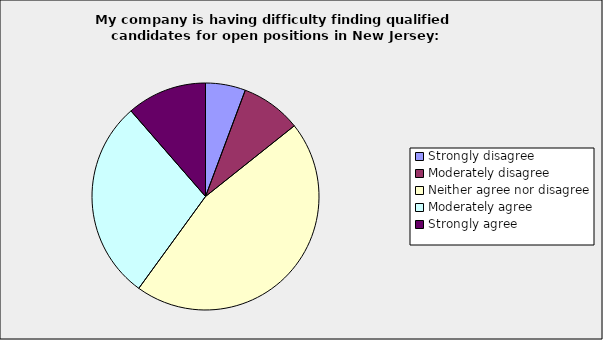
| Category | Series 0 |
|---|---|
| Strongly disagree | 0.057 |
| Moderately disagree | 0.086 |
| Neither agree nor disagree | 0.457 |
| Moderately agree | 0.286 |
| Strongly agree | 0.114 |